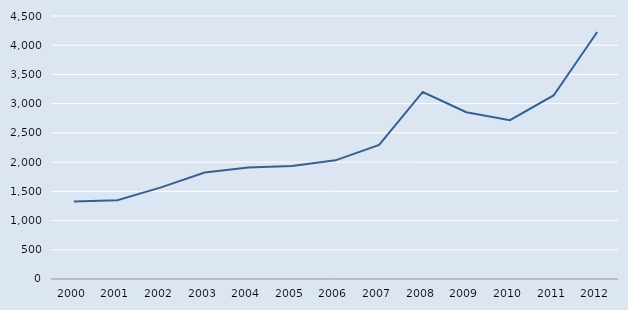
| Category | Series 0 |
|---|---|
| 2000.0 | 1324 |
| 2001.0 | 1347 |
| 2002.0 | 1567 |
| 2003.0 | 1823 |
| 2004.0 | 1907 |
| 2005.0 | 1934 |
| 2006.0 | 2030 |
| 2007.0 | 2293 |
| 2008.0 | 3200 |
| 2009.0 | 2854 |
| 2010.0 | 2717 |
| 2011.0 | 3140 |
| 2012.0 | 4227 |